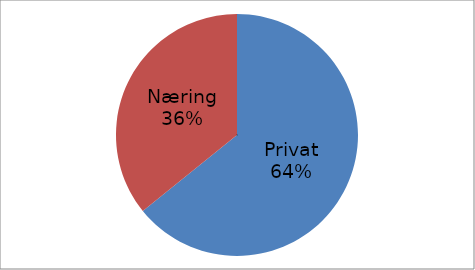
| Category | Series 0 |
|---|---|
| Privat | 35636281 |
| Næring | 19869597 |